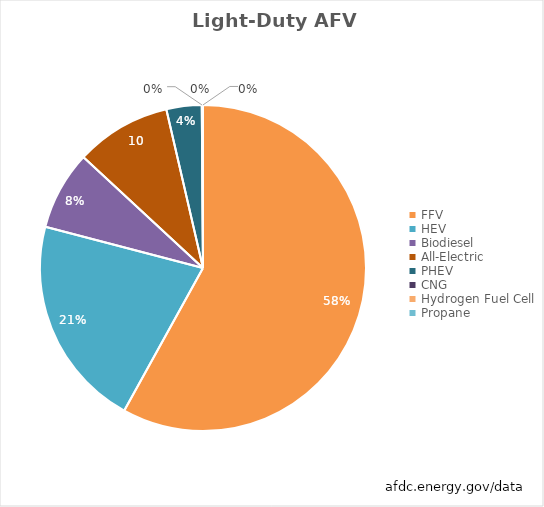
| Category | Series 0 |
|---|---|
| FFV | 19000147 |
| HEV | 6889756 |
| Biodiesel | 2562839 |
| All-Electric | 3105175 |
| PHEV | 1143917 |
| CNG | 16806 |
| Hydrogen Fuel Cell | 16367 |
| Propane | 6377 |